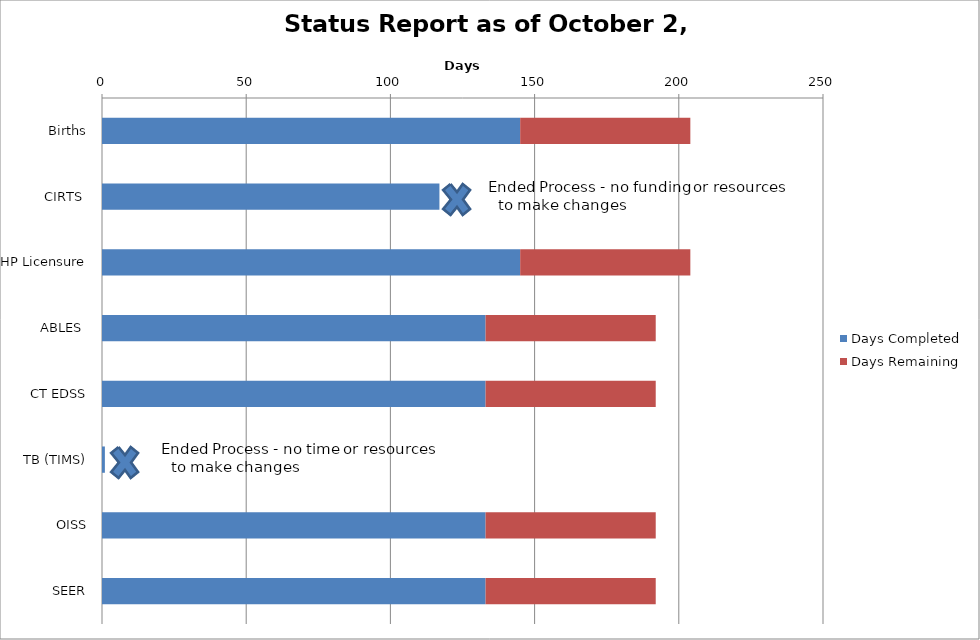
| Category | Days Completed | Days Remaining |
|---|---|---|
| Births | 145 | 59 |
| CIRTS  | 117 | 0 |
| HP Licensure | 145 | 59 |
| ABLES  | 133 | 59 |
| CT EDSS | 133 | 59 |
| TB (TIMS) | 1 | 0 |
| OISS | 133 | 59 |
| SEER | 133 | 59 |